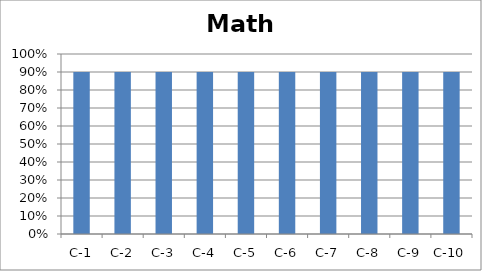
| Category | Math |
|---|---|
| C-1 | 0.9 |
| C-2 | 0.9 |
| C-3 | 0.9 |
| C-4 | 0.9 |
| C-5 | 0.9 |
| C-6 | 0.9 |
| C-7 | 0.9 |
| C-8 | 0.9 |
| C-9 | 0.9 |
| C-10 | 0.9 |